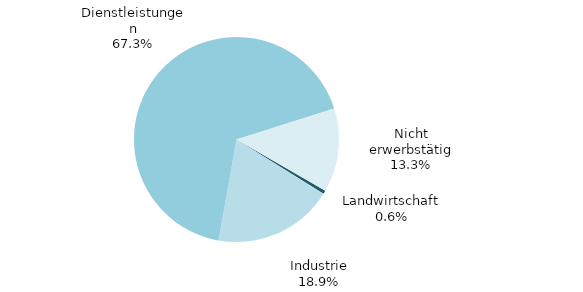
| Category | Series 0 |
|---|---|
| Landwirtschaft | 2 |
| Industrie | 70 |
| Dienstleistungen | 249 |
| Nicht erwerbstätig | 49 |